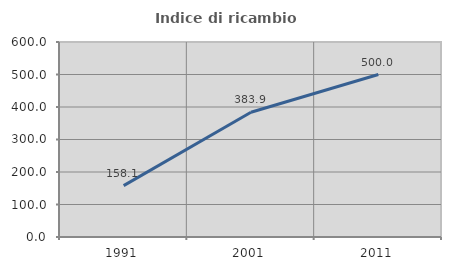
| Category | Indice di ricambio occupazionale  |
|---|---|
| 1991.0 | 158.065 |
| 2001.0 | 383.871 |
| 2011.0 | 500 |